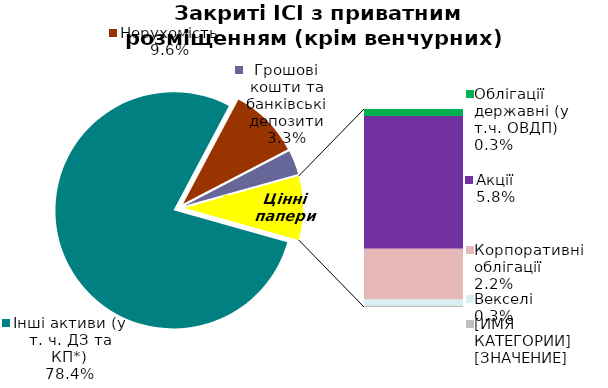
| Category | Series 0 |
|---|---|
| Інші активи (у т. ч. ДЗ та КП*) | 0.784 |
| Нерухомість | 0.096 |
| Грошові кошти та банківські депозити | 0.033 |
| Банківські метали | 0 |
| Облігації державні (у т.ч. ОВДП) | 0.003 |
| Облігації місцевих позик | 0 |
| Акції | 0.058 |
| Корпоративні облігації | 0.022 |
| Векселі | 0.003 |
| Інші ЦП  | 0.001 |